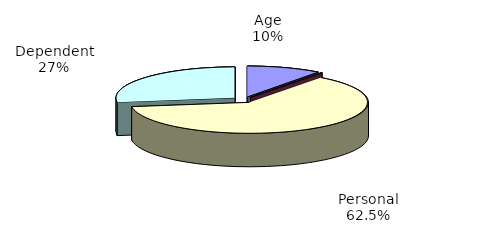
| Category | Series 0 |
|---|---|
| Age | 880522 |
| Blindness | 9021 |
| Personal | 5415496 |
| Dependent | 2357970 |